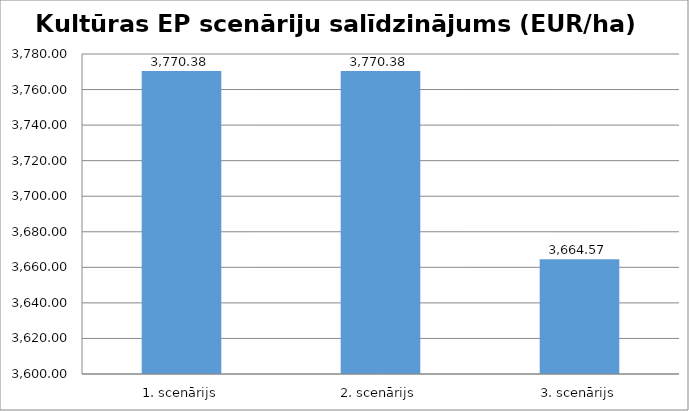
| Category | 1. scenārijs |
|---|---|
| 1. scenārijs | 3770.381 |
| 2. scenārijs | 3770.381 |
| 3. scenārijs | 3664.572 |